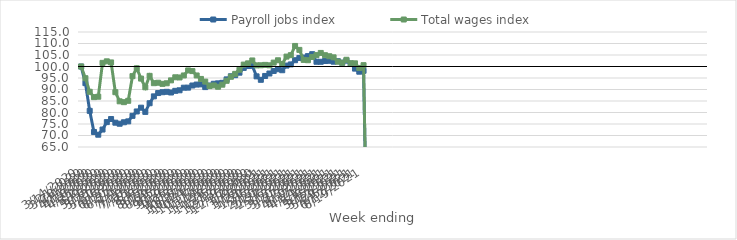
| Category | Payroll jobs index | Total wages index |
|---|---|---|
| 14/03/2020 | 100 | 100 |
| 21/03/2020 | 92.755 | 94.908 |
| 28/03/2020 | 80.714 | 89.006 |
| 04/04/2020 | 71.532 | 86.681 |
| 11/04/2020 | 70.345 | 86.864 |
| 18/04/2020 | 72.594 | 101.579 |
| 25/04/2020 | 75.828 | 102.243 |
| 02/05/2020 | 77.158 | 101.773 |
| 09/05/2020 | 75.576 | 88.828 |
| 16/05/2020 | 75.111 | 84.864 |
| 23/05/2020 | 75.753 | 84.497 |
| 30/05/2020 | 76.143 | 85.088 |
| 06/06/2020 | 78.542 | 95.806 |
| 13/06/2020 | 80.453 | 99.226 |
| 20/06/2020 | 82.094 | 94.745 |
| 27/06/2020 | 80.261 | 90.962 |
| 04/07/2020 | 84.024 | 95.934 |
| 11/07/2020 | 87.015 | 92.749 |
| 18/07/2020 | 88.456 | 92.935 |
| 25/07/2020 | 88.822 | 92.449 |
| 01/08/2020 | 88.994 | 92.71 |
| 08/08/2020 | 88.694 | 93.969 |
| 15/08/2020 | 89.421 | 95.311 |
| 22/08/2020 | 89.656 | 95.232 |
| 29/08/2020 | 90.783 | 96.104 |
| 05/09/2020 | 90.809 | 98.29 |
| 12/09/2020 | 91.734 | 98.008 |
| 19/09/2020 | 92.152 | 96.101 |
| 26/09/2020 | 92.232 | 94.595 |
| 03/10/2020 | 91.04 | 93.437 |
| 10/10/2020 | 91.751 | 91.481 |
| 17/10/2020 | 92.492 | 91.778 |
| 24/10/2020 | 92.671 | 91.182 |
| 31/10/2020 | 92.897 | 92.097 |
| 07/11/2020 | 94.399 | 93.778 |
| 14/11/2020 | 95.749 | 95.558 |
| 21/11/2020 | 96.229 | 96.804 |
| 28/11/2020 | 97.31 | 98.589 |
| 05/12/2020 | 99.393 | 100.823 |
| 12/12/2020 | 100.204 | 101.367 |
| 19/12/2020 | 100.303 | 102.629 |
| 26/12/2020 | 95.718 | 100.493 |
| 02/01/2021 | 94.217 | 100.531 |
| 09/01/2021 | 95.888 | 100.7 |
| 16/01/2021 | 96.954 | 100.519 |
| 23/01/2021 | 98.054 | 101.695 |
| 30/01/2021 | 98.806 | 102.704 |
| 06/02/2021 | 98.378 | 101.14 |
| 13/02/2021 | 100.399 | 104.306 |
| 20/02/2021 | 100.906 | 104.923 |
| 27/02/2021 | 102.736 | 108.935 |
| 06/03/2021 | 103.718 | 107.227 |
| 13/03/2021 | 103.889 | 102.877 |
| 20/03/2021 | 104.507 | 102.719 |
| 27/03/2021 | 105.358 | 104.153 |
| 03/04/2021 | 102.064 | 104.948 |
| 10/04/2021 | 102.053 | 105.898 |
| 17/04/2021 | 102.397 | 104.918 |
| 24/04/2021 | 102.48 | 104.46 |
| 01/05/2021 | 102.094 | 103.986 |
| 08/05/2021 | 102.301 | 102.104 |
| 15/05/2021 | 101.68 | 101.621 |
| 22/05/2021 | 102.544 | 102.926 |
| 29/05/2021 | 101.256 | 101.422 |
| 05/06/2021 | 99.08 | 101.375 |
| 12/06/2021 | 97.741 | 99.374 |
| 19/06/2021 | 98.122 | 100.576 |